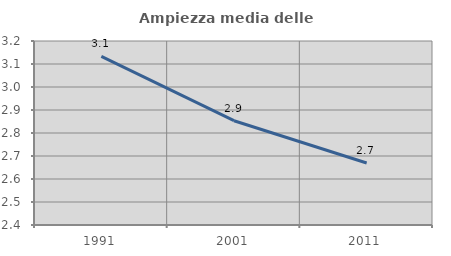
| Category | Ampiezza media delle famiglie |
|---|---|
| 1991.0 | 3.134 |
| 2001.0 | 2.853 |
| 2011.0 | 2.67 |